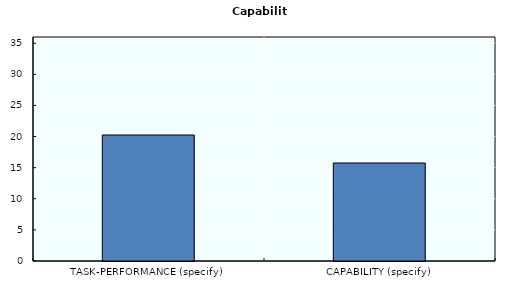
| Category | Capability |
|---|---|
| TASK-PERFORMANCE (specify) | 20.25 |
| CAPABILITY (specify) | 15.75 |